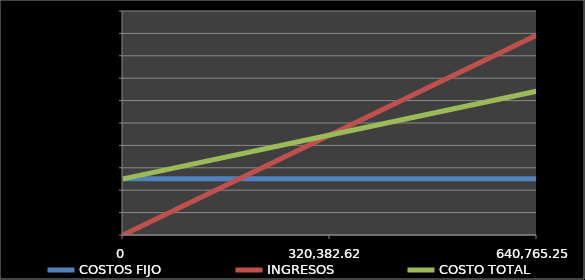
| Category | COSTOS FIJO | INGRESOS | COSTO TOTAL |
|---|---|---|---|
| 0.0 | 125376741 | 0 | 125376741 |
| 320382.6235158332 | 125376741 | 223221594.222 | 223221594.222 |
| 640765.2470316665 | 125376741 | 446443188.443 | 321066447.443 |